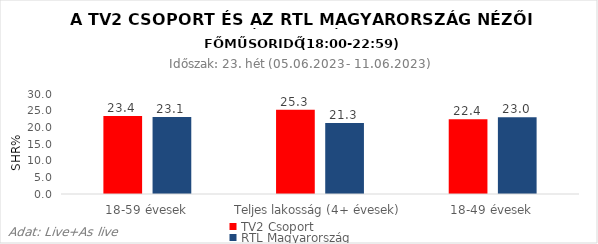
| Category | TV2 Csoport | RTL Magyarország |
|---|---|---|
| 18-59 évesek | 23.4 | 23.1 |
| Teljes lakosság (4+ évesek) | 25.3 | 21.3 |
| 18-49 évesek | 22.4 | 23 |